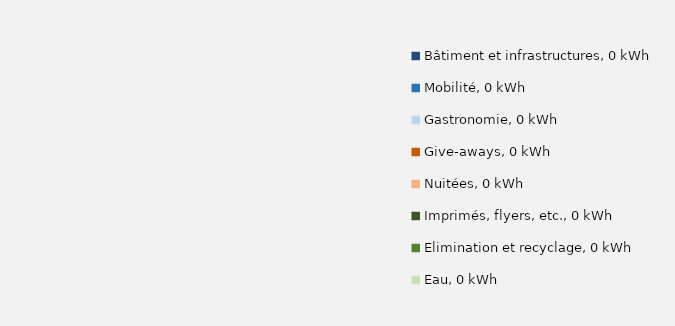
| Category | Series 0 |
|---|---|
| Bâtiment et infrastructures, 0 kWh | 0 |
| Mobilité, 0 kWh | 0 |
| Gastronomie, 0 kWh | 0 |
| Give-aways, 0 kWh | 0 |
| Nuitées, 0 kWh | 0 |
| Imprimés, flyers, etc., 0 kWh | 0 |
| Elimination et recyclage, 0 kWh | 0 |
| Eau, 0 kWh | 0 |